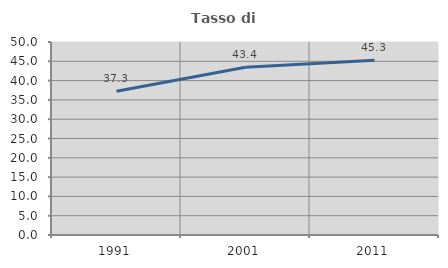
| Category | Tasso di occupazione   |
|---|---|
| 1991.0 | 37.254 |
| 2001.0 | 43.434 |
| 2011.0 | 45.272 |